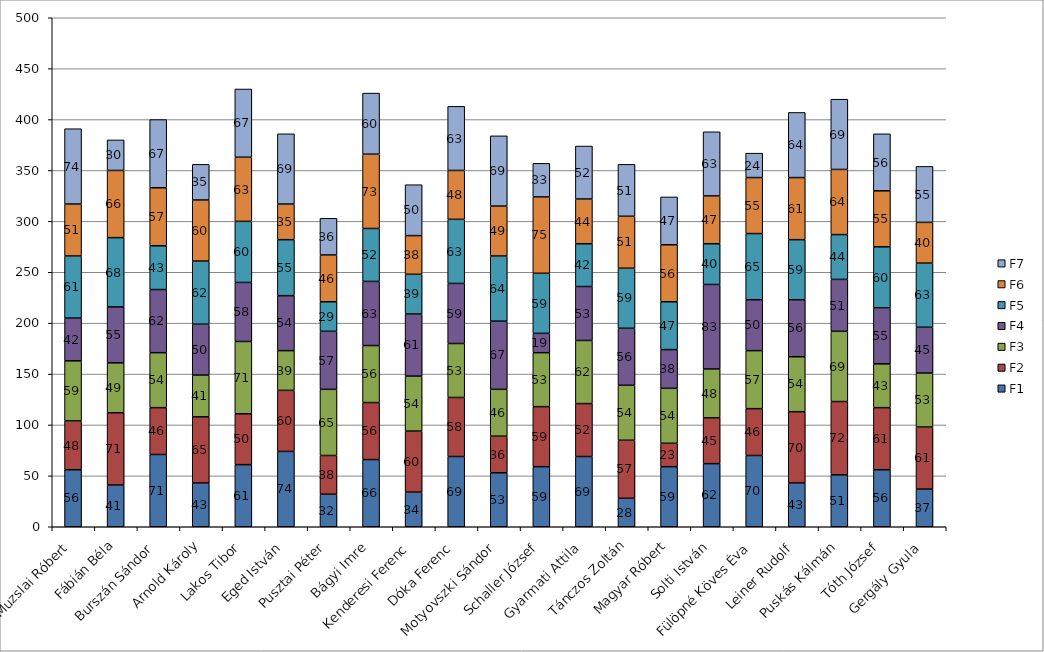
| Category | F1 | F2 | F3 | F4 | F5 | F6 | F7 |
|---|---|---|---|---|---|---|---|
| Muzslai Róbert | 56 | 48 | 59 | 42 | 61 | 51 | 74 |
| Fábián Béla | 41 | 71 | 49 | 55 | 68 | 66 | 30 |
| Burszán Sándor | 71 | 46 | 54 | 62 | 43 | 57 | 67 |
| Arnold Károly | 43 | 65 | 41 | 50 | 62 | 60 | 35 |
| Lakos Tibor | 61 | 50 | 71 | 58 | 60 | 63 | 67 |
| Eged István | 74 | 60 | 39 | 54 | 55 | 35 | 69 |
| Pusztai Péter | 32 | 38 | 65 | 57 | 29 | 46 | 36 |
| Bágyi Imre | 66 | 56 | 56 | 63 | 52 | 73 | 60 |
| Kenderesi Ferenc | 34 | 60 | 54 | 61 | 39 | 38 | 50 |
| Dóka Ferenc | 69 | 58 | 53 | 59 | 63 | 48 | 63 |
| Motyovszki Sándor | 53 | 36 | 46 | 67 | 64 | 49 | 69 |
| Schaller József | 59 | 59 | 53 | 19 | 59 | 75 | 33 |
| Gyarmati Attila | 69 | 52 | 62 | 53 | 42 | 44 | 52 |
| Tánczos Zoltán | 28 | 57 | 54 | 56 | 59 | 51 | 51 |
| Magyar Róbert | 59 | 23 | 54 | 38 | 47 | 56 | 47 |
| Solti István | 62 | 45 | 48 | 83 | 40 | 47 | 63 |
| Fülöpné Köves Éva | 70 | 46 | 57 | 50 | 65 | 55 | 24 |
| Leiner Rudolf | 43 | 70 | 54 | 56 | 59 | 61 | 64 |
| Puskás Kálmán | 51 | 72 | 69 | 51 | 44 | 64 | 69 |
| Tóth József | 56 | 61 | 43 | 55 | 60 | 55 | 56 |
| Gergály Gyula | 37 | 61 | 53 | 45 | 63 | 40 | 55 |